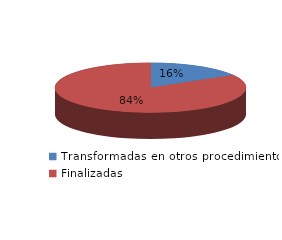
| Category | Series 0 |
|---|---|
| Transformadas en otros procedimientos | 2004 |
| Finalizadas | 10147 |